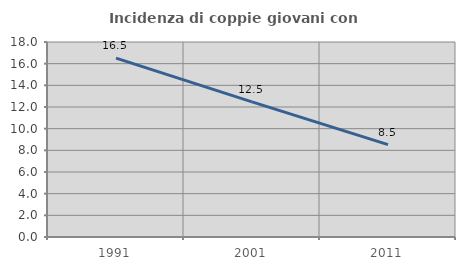
| Category | Incidenza di coppie giovani con figli |
|---|---|
| 1991.0 | 16.516 |
| 2001.0 | 12.468 |
| 2011.0 | 8.523 |